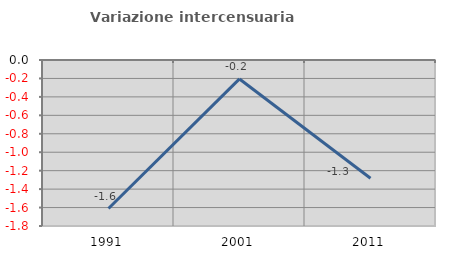
| Category | Variazione intercensuaria annua |
|---|---|
| 1991.0 | -1.61 |
| 2001.0 | -0.205 |
| 2011.0 | -1.283 |